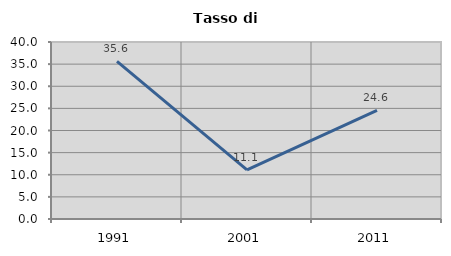
| Category | Tasso di disoccupazione   |
|---|---|
| 1991.0 | 35.616 |
| 2001.0 | 11.111 |
| 2011.0 | 24.561 |